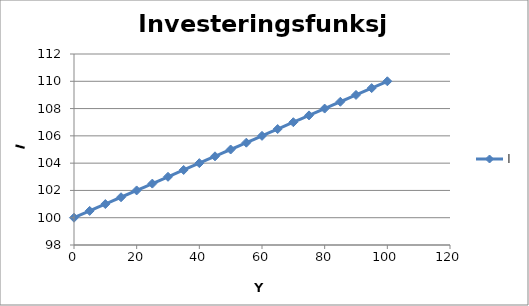
| Category | I |
|---|---|
| 0.0 | 100 |
| 5.0 | 100.5 |
| 10.0 | 101 |
| 15.0 | 101.5 |
| 20.0 | 102 |
| 25.0 | 102.5 |
| 30.0 | 103 |
| 35.0 | 103.5 |
| 40.0 | 104 |
| 45.0 | 104.5 |
| 50.0 | 105 |
| 55.0 | 105.5 |
| 60.0 | 106 |
| 65.0 | 106.5 |
| 70.0 | 107 |
| 75.0 | 107.5 |
| 80.0 | 108 |
| 85.0 | 108.5 |
| 90.0 | 109 |
| 95.0 | 109.5 |
| 100.0 | 110 |